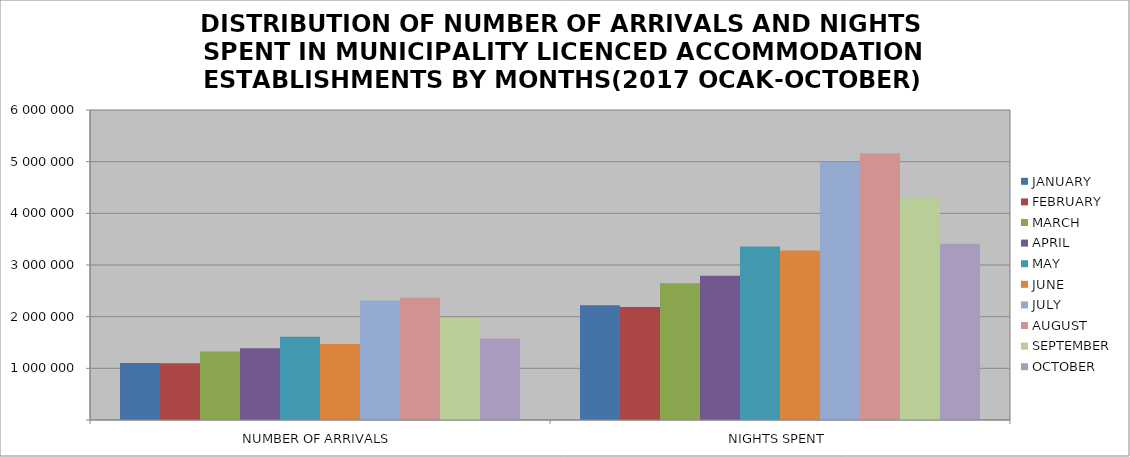
| Category | JANUARY | FEBRUARY | MARCH | APRIL | MAY | JUNE | JULY | AUGUST | SEPTEMBER | OCTOBER |
|---|---|---|---|---|---|---|---|---|---|---|
| NUMBER OF ARRIVALS | 1104649 | 1099366 | 1327993 | 1389075 | 1611959 | 1472053 | 2311504 | 2364597 | 1973724 | 1579336 |
| NIGHTS SPENT | 2222261 | 2187982 | 2645959 | 2791881 | 3355819 | 3280620 | 4994703 | 5161854 | 4292043 | 3411995 |